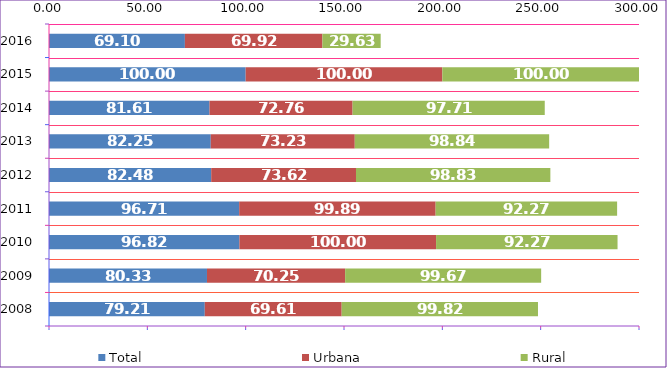
| Category | Total | Urbana | Rural |
|---|---|---|---|
| 2008.0 | 79.21 | 69.61 | 99.82 |
| 2009.0 | 80.33 | 70.25 | 99.67 |
| 2010.0 | 96.82 | 100 | 92.27 |
| 2011.0 | 96.71 | 99.89 | 92.27 |
| 2012.0 | 82.48 | 73.62 | 98.83 |
| 2013.0 | 82.25 | 73.23 | 98.84 |
| 2014.0 | 81.61 | 72.76 | 97.71 |
| 2015.0 | 100 | 100 | 100 |
| 2016.0 | 69.1 | 69.92 | 29.63 |